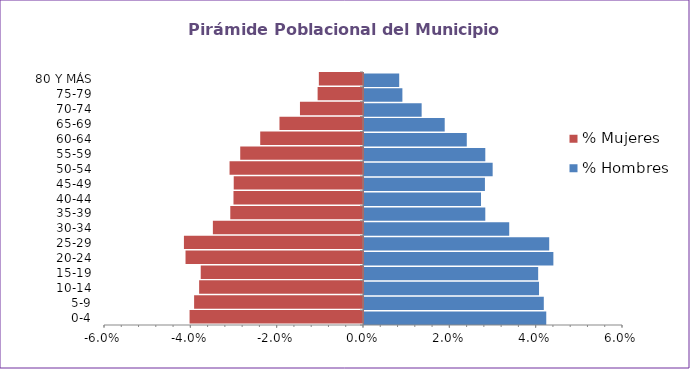
| Category | % Hombres | % Mujeres |
|---|---|---|
| 0-4 | 0.042 | -0.04 |
| 5-9 | 0.042 | -0.039 |
| 10-14 | 0.041 | -0.038 |
| 15-19 | 0.04 | -0.038 |
| 20-24 | 0.044 | -0.041 |
| 25-29 | 0.043 | -0.041 |
| 30-34 | 0.034 | -0.035 |
| 35-39 | 0.028 | -0.031 |
| 40-44 | 0.027 | -0.03 |
| 45-49 | 0.028 | -0.03 |
| 50-54 | 0.03 | -0.031 |
| 55-59 | 0.028 | -0.028 |
| 60-64 | 0.024 | -0.024 |
| 65-69 | 0.019 | -0.019 |
| 70-74 | 0.013 | -0.015 |
| 75-79 | 0.009 | -0.011 |
| 80 Y MÁS | 0.008 | -0.01 |